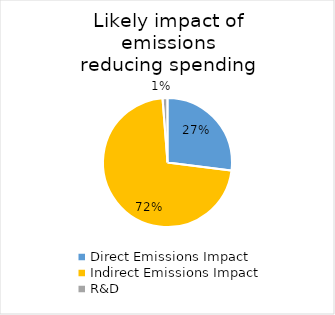
| Category | Series 0 |
|---|---|
| Direct Emissions Impact | 232361842235.14 |
| Indirect Emissions Impact | 617723224000 |
| R&D | 10603715000 |